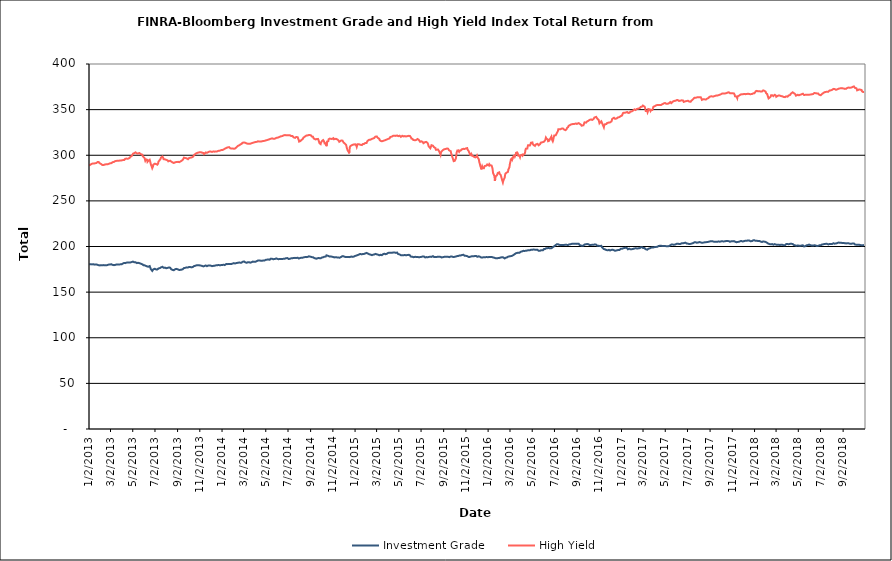
| Category | Investment Grade | High Yield |
|---|---|---|
| 1/2/13 | 180.418 | 288.714 |
| 1/3/13 | 180.314 | 289.229 |
| 1/4/13 | 180.218 | 289.691 |
| 1/7/13 | 180.416 | 290.115 |
| 1/8/13 | 180.534 | 290.229 |
| 1/9/13 | 180.497 | 290.492 |
| 1/10/13 | 180.403 | 290.811 |
| 1/11/13 | 180.366 | 291.068 |
| 1/14/13 | 180.474 | 290.972 |
| 1/15/13 | 180.457 | 290.556 |
| 1/16/13 | 180.451 | 290.825 |
| 1/17/13 | 180.126 | 291.101 |
| 1/18/13 | 180.262 | 291.424 |
| 1/22/13 | 180.359 | 291.542 |
| 1/23/13 | 180.414 | 291.942 |
| 1/24/13 | 180.258 | 292.239 |
| 1/25/13 | 179.88 | 292.639 |
| 1/28/13 | 179.528 | 292.699 |
| 1/29/13 | 179.475 | 291.968 |
| 1/30/13 | 179.216 | 291.435 |
| 1/31/13 | 179.282 | 290.547 |
| 2/1/13 | 179.319 | 290.795 |
| 2/4/13 | 179.396 | 290.328 |
| 2/5/13 | 179.186 | 289.927 |
| 2/6/13 | 179.33 | 289.626 |
| 2/7/13 | 179.53 | 289.348 |
| 2/8/13 | 179.424 | 289.123 |
| 2/11/13 | 179.601 | 289.312 |
| 2/12/13 | 179.432 | 289.517 |
| 2/13/13 | 179.276 | 289.685 |
| 2/14/13 | 179.47 | 289.903 |
| 2/15/13 | 179.428 | 289.938 |
| 2/19/13 | 179.436 | 290.138 |
| 2/20/13 | 179.393 | 290.311 |
| 2/21/13 | 179.67 | 289.894 |
| 2/22/13 | 179.791 | 290.126 |
| 2/25/13 | 180.195 | 290.674 |
| 2/26/13 | 180.36 | 290.49 |
| 2/27/13 | 180.275 | 290.647 |
| 2/28/13 | 180.295 | 291.129 |
| 3/1/13 | 180.498 | 291.056 |
| 3/4/13 | 180.547 | 291.371 |
| 3/5/13 | 180.405 | 292.183 |
| 3/6/13 | 180.162 | 292.263 |
| 3/7/13 | 179.864 | 292.342 |
| 3/8/13 | 179.491 | 292.364 |
| 3/11/13 | 179.561 | 292.71 |
| 3/12/13 | 179.833 | 292.986 |
| 3/13/13 | 179.763 | 292.997 |
| 3/14/13 | 179.781 | 293.521 |
| 3/15/13 | 180.017 | 293.66 |
| 3/18/13 | 180.309 | 293.843 |
| 3/19/13 | 180.56 | 293.925 |
| 3/20/13 | 180.234 | 294.009 |
| 3/21/13 | 180.19 | 293.882 |
| 3/22/13 | 180.169 | 293.97 |
| 3/25/13 | 180.202 | 294.027 |
| 3/26/13 | 180.105 | 293.998 |
| 3/27/13 | 180.419 | 294.128 |
| 3/28/13 | 180.443 | 294.272 |
| 4/1/13 | 180.531 | 294.371 |
| 4/2/13 | 180.461 | 294.579 |
| 4/3/13 | 180.789 | 294.607 |
| 4/4/13 | 181.285 | 294.648 |
| 4/5/13 | 181.945 | 294.632 |
| 4/8/13 | 182.004 | 294.735 |
| 4/9/13 | 182.049 | 295.329 |
| 4/10/13 | 181.764 | 295.607 |
| 4/11/13 | 181.777 | 296.149 |
| 4/12/13 | 182.134 | 296.506 |
| 4/15/13 | 182.382 | 296.343 |
| 4/16/13 | 182.309 | 296.556 |
| 4/17/13 | 182.364 | 296.241 |
| 4/18/13 | 182.416 | 296.14 |
| 4/19/13 | 182.332 | 296.394 |
| 4/22/13 | 182.498 | 296.78 |
| 4/23/13 | 182.612 | 297.392 |
| 4/24/13 | 182.699 | 297.751 |
| 4/25/13 | 182.517 | 298.19 |
| 4/26/13 | 182.907 | 298.71 |
| 4/29/13 | 183.005 | 299.268 |
| 4/30/13 | 183.021 | 300.067 |
| 5/1/13 | 183.331 | 300.856 |
| 5/2/13 | 183.461 | 301.386 |
| 5/3/13 | 182.88 | 301.968 |
| 5/6/13 | 182.703 | 302.267 |
| 5/7/13 | 182.682 | 302.749 |
| 5/8/13 | 182.755 | 303.216 |
| 5/9/13 | 182.747 | 303.174 |
| 5/10/13 | 182.048 | 302.716 |
| 5/13/13 | 181.775 | 302.027 |
| 5/14/13 | 181.74 | 301.767 |
| 5/15/13 | 181.725 | 301.705 |
| 5/16/13 | 182.182 | 302.013 |
| 5/17/13 | 181.879 | 302.136 |
| 5/20/13 | 181.74 | 302.424 |
| 5/21/13 | 181.831 | 302.406 |
| 5/22/13 | 181.51 | 302.291 |
| 5/23/13 | 181.254 | 301.321 |
| 5/24/13 | 181.269 | 300.988 |
| 5/28/13 | 180.478 | 300.573 |
| 5/29/13 | 179.983 | 298.941 |
| 5/30/13 | 179.917 | 298.874 |
| 5/31/13 | 179.394 | 298.159 |
| 6/3/13 | 179.454 | 296.868 |
| 6/4/13 | 179.162 | 296.146 |
| 6/5/13 | 178.829 | 293.959 |
| 6/6/13 | 178.861 | 293.342 |
| 6/7/13 | 178.695 | 295.478 |
| 6/10/13 | 178.13 | 295.107 |
| 6/11/13 | 177.577 | 292.825 |
| 6/12/13 | 177.663 | 293.39 |
| 6/13/13 | 177.842 | 292.841 |
| 6/14/13 | 178.613 | 294.18 |
| 6/17/13 | 178.554 | 295.091 |
| 6/18/13 | 178.04 | 294.81 |
| 6/19/13 | 177.631 | 294.581 |
| 6/20/13 | 175.366 | 290.384 |
| 6/21/13 | 174.752 | 289.646 |
| 6/24/13 | 173.249 | 285.828 |
| 6/25/13 | 173.543 | 286.221 |
| 6/26/13 | 174.232 | 287.65 |
| 6/27/13 | 174.959 | 289.73 |
| 6/28/13 | 175.137 | 290.228 |
| 7/1/13 | 175.576 | 290.788 |
| 7/2/13 | 175.941 | 291.105 |
| 7/3/13 | 175.988 | 290.585 |
| 7/5/13 | 174.738 | 290.273 |
| 7/8/13 | 174.822 | 289.667 |
| 7/9/13 | 175.184 | 290.346 |
| 7/10/13 | 175.151 | 290.844 |
| 7/11/13 | 175.898 | 292.926 |
| 7/12/13 | 176.14 | 293.609 |
| 7/15/13 | 176.351 | 294.919 |
| 7/16/13 | 176.666 | 295.47 |
| 7/17/13 | 177.121 | 296.161 |
| 7/18/13 | 177.12 | 297.519 |
| 7/19/13 | 177.42 | 297.862 |
| 7/22/13 | 177.769 | 298.556 |
| 7/23/13 | 177.698 | 298.585 |
| 7/24/13 | 176.991 | 297.183 |
| 7/25/13 | 176.669 | 295.729 |
| 7/26/13 | 177.005 | 295.673 |
| 7/29/13 | 176.886 | 295.5 |
| 7/30/13 | 176.857 | 295.631 |
| 7/31/13 | 176.508 | 295.054 |
| 8/1/13 | 176.191 | 295.026 |
| 8/2/13 | 176.666 | 294.693 |
| 8/5/13 | 176.529 | 294.436 |
| 8/6/13 | 176.451 | 293.84 |
| 8/7/13 | 176.654 | 293.33 |
| 8/8/13 | 176.91 | 293.6 |
| 8/9/13 | 176.889 | 293.805 |
| 8/12/13 | 176.834 | 294.05 |
| 8/13/13 | 176.01 | 293.634 |
| 8/14/13 | 175.868 | 293.796 |
| 8/15/13 | 175.063 | 293.112 |
| 8/16/13 | 174.752 | 292.875 |
| 8/19/13 | 174.276 | 292.095 |
| 8/20/13 | 174.561 | 291.862 |
| 8/21/13 | 174.282 | 291.78 |
| 8/22/13 | 173.987 | 291.473 |
| 8/23/13 | 174.557 | 291.996 |
| 8/26/13 | 175.088 | 292.307 |
| 8/27/13 | 175.55 | 292.162 |
| 8/28/13 | 175.33 | 292.241 |
| 8/29/13 | 175.469 | 292.563 |
| 8/30/13 | 175.752 | 293.08 |
| 9/3/13 | 174.857 | 292.778 |
| 9/4/13 | 174.803 | 292.764 |
| 9/5/13 | 173.839 | 292.314 |
| 9/6/13 | 174.212 | 292.438 |
| 9/9/13 | 174.432 | 293.107 |
| 9/10/13 | 174.027 | 293 |
| 9/11/13 | 174.23 | 293.246 |
| 9/12/13 | 174.624 | 293.821 |
| 9/13/13 | 174.528 | 294.088 |
| 9/16/13 | 175.136 | 295.082 |
| 9/17/13 | 175.056 | 295.217 |
| 9/18/13 | 175.426 | 295.876 |
| 9/19/13 | 176.394 | 297.362 |
| 9/20/13 | 176.442 | 297.438 |
| 9/23/13 | 176.64 | 296.94 |
| 9/24/13 | 177.073 | 297.042 |
| 9/25/13 | 177.29 | 296.788 |
| 9/26/13 | 177.116 | 296.649 |
| 9/27/13 | 177.17 | 296.298 |
| 9/30/13 | 177.029 | 295.684 |
| 10/1/13 | 177.035 | 296.078 |
| 10/2/13 | 177.315 | 296.334 |
| 10/3/13 | 177.535 | 296.928 |
| 10/4/13 | 177.247 | 297.16 |
| 10/7/13 | 177.419 | 297.396 |
| 10/8/13 | 177.369 | 297.091 |
| 10/9/13 | 177.218 | 296.983 |
| 10/10/13 | 177.152 | 297.583 |
| 10/11/13 | 177.569 | 298.016 |
| 10/14/13 | 177.705 | 298.362 |
| 10/15/13 | 177.422 | 298.46 |
| 10/16/13 | 177.683 | 299.078 |
| 10/17/13 | 178.623 | 300.339 |
| 10/18/13 | 179.055 | 301.275 |
| 10/21/13 | 178.946 | 301.75 |
| 10/22/13 | 179.5 | 302.295 |
| 10/23/13 | 179.642 | 302.152 |
| 10/24/13 | 179.451 | 302.314 |
| 10/25/13 | 179.509 | 302.45 |
| 10/28/13 | 179.497 | 302.947 |
| 10/29/13 | 179.506 | 303.014 |
| 10/30/13 | 179.7 | 303.179 |
| 10/31/13 | 179.418 | 303.199 |
| 11/1/13 | 179.055 | 302.946 |
| 11/4/13 | 179.086 | 303.346 |
| 11/5/13 | 178.619 | 302.838 |
| 11/6/13 | 178.743 | 302.912 |
| 11/7/13 | 178.912 | 302.935 |
| 11/8/13 | 178.027 | 302.168 |
| 11/11/13 | 178.148 | 302.481 |
| 11/12/13 | 177.732 | 301.574 |
| 11/13/13 | 178.044 | 301.25 |
| 11/14/13 | 178.581 | 301.928 |
| 11/15/13 | 178.699 | 302.34 |
| 11/18/13 | 179.216 | 303.154 |
| 11/19/13 | 179.056 | 303.064 |
| 11/20/13 | 178.763 | 302.951 |
| 11/21/13 | 178.483 | 302.637 |
| 11/22/13 | 178.866 | 303.162 |
| 11/25/13 | 179.18 | 303.49 |
| 11/26/13 | 179.447 | 303.451 |
| 11/27/13 | 179.295 | 303.964 |
| 11/29/13 | 179.243 | 304.187 |
| 12/2/13 | 178.936 | 303.959 |
| 12/3/13 | 179.077 | 304.022 |
| 12/4/13 | 178.638 | 303.759 |
| 12/5/13 | 178.482 | 303.661 |
| 12/6/13 | 178.524 | 303.958 |
| 12/9/13 | 178.794 | 304.229 |
| 12/10/13 | 179.26 | 304.454 |
| 12/11/13 | 179.244 | 304.384 |
| 12/12/13 | 178.971 | 303.923 |
| 12/13/13 | 179.064 | 304.033 |
| 12/16/13 | 179.328 | 304.232 |
| 12/17/13 | 179.548 | 304.208 |
| 12/18/13 | 179.531 | 304.127 |
| 12/19/13 | 179.415 | 304.237 |
| 12/20/13 | 179.659 | 304.524 |
| 12/23/13 | 179.774 | 304.868 |
| 12/24/13 | 179.596 | 304.866 |
| 12/26/13 | 179.421 | 304.99 |
| 12/27/13 | 179.346 | 305.23 |
| 12/30/13 | 179.619 | 305.626 |
| 12/31/13 | 179.735 | 305.727 |
| 1/2/14 | 179.728 | 305.662 |
| 1/3/14 | 179.753 | 305.864 |
| 1/6/14 | 180.039 | 306.408 |
| 1/7/14 | 180.116 | 306.94 |
| 1/8/14 | 179.579 | 306.969 |
| 1/9/14 | 179.671 | 307.098 |
| 1/10/14 | 180.4 | 307.505 |
| 1/13/14 | 180.811 | 307.909 |
| 1/14/14 | 180.596 | 307.963 |
| 1/15/14 | 180.41 | 308.397 |
| 1/16/14 | 180.672 | 308.499 |
| 1/17/14 | 180.742 | 308.963 |
| 1/21/14 | 180.804 | 308.937 |
| 1/22/14 | 180.542 | 309.084 |
| 1/23/14 | 180.718 | 308.76 |
| 1/24/14 | 180.846 | 307.697 |
| 1/27/14 | 180.803 | 307.291 |
| 1/28/14 | 180.86 | 307.421 |
| 1/29/14 | 181.147 | 307.34 |
| 1/30/14 | 181.221 | 307.5 |
| 1/31/14 | 181.355 | 307.291 |
| 2/3/14 | 181.763 | 307.131 |
| 2/4/14 | 181.689 | 307.001 |
| 2/5/14 | 181.423 | 306.844 |
| 2/6/14 | 181.395 | 307.294 |
| 2/7/14 | 181.768 | 308.141 |
| 2/10/14 | 181.871 | 308.736 |
| 2/11/14 | 181.686 | 309.108 |
| 2/12/14 | 181.564 | 309.671 |
| 2/13/14 | 182.068 | 309.957 |
| 2/14/14 | 182.2 | 310.47 |
| 2/18/14 | 182.466 | 310.993 |
| 2/19/14 | 182.465 | 311.258 |
| 2/20/14 | 182.013 | 311.434 |
| 2/21/14 | 182.187 | 311.855 |
| 2/24/14 | 182.309 | 312.532 |
| 2/25/14 | 182.786 | 313.061 |
| 2/26/14 | 182.966 | 313.386 |
| 2/27/14 | 183.242 | 313.688 |
| 2/28/14 | 183.242 | 313.95 |
| 3/3/14 | 183.617 | 313.958 |
| 3/4/14 | 183.201 | 314.086 |
| 3/5/14 | 183.098 | 314.146 |
| 3/6/14 | 182.707 | 313.68 |
| 3/7/14 | 182.162 | 313.23 |
| 3/10/14 | 182.161 | 312.94 |
| 3/11/14 | 182.18 | 312.996 |
| 3/12/14 | 182.373 | 312.805 |
| 3/13/14 | 182.68 | 312.601 |
| 3/14/14 | 182.791 | 312.17 |
| 3/17/14 | 182.764 | 312.694 |
| 3/18/14 | 182.841 | 312.994 |
| 3/19/14 | 182.684 | 313.321 |
| 3/20/14 | 182.283 | 312.665 |
| 3/21/14 | 182.579 | 313.2 |
| 3/24/14 | 182.821 | 313.213 |
| 3/25/14 | 182.966 | 313.327 |
| 3/26/14 | 183.239 | 313.866 |
| 3/27/14 | 183.453 | 313.624 |
| 3/28/14 | 183.28 | 313.939 |
| 3/31/14 | 183.295 | 314.186 |
| 4/1/14 | 183.326 | 314.175 |
| 4/2/14 | 182.944 | 314.368 |
| 4/3/14 | 183.181 | 314.462 |
| 4/4/14 | 183.667 | 314.772 |
| 4/7/14 | 184.06 | 314.72 |
| 4/8/14 | 184.138 | 314.878 |
| 4/9/14 | 184.201 | 315.146 |
| 4/10/14 | 184.696 | 315.282 |
| 4/11/14 | 184.791 | 314.863 |
| 4/14/14 | 184.777 | 315.029 |
| 4/15/14 | 184.821 | 314.902 |
| 4/16/14 | 184.74 | 315.02 |
| 4/17/14 | 184.509 | 315.085 |
| 4/21/14 | 184.449 | 315.235 |
| 4/22/14 | 184.345 | 315.366 |
| 4/23/14 | 184.609 | 315.544 |
| 4/24/14 | 184.557 | 315.604 |
| 4/25/14 | 184.79 | 315.711 |
| 4/28/14 | 184.686 | 315.777 |
| 4/29/14 | 184.555 | 315.908 |
| 4/30/14 | 184.879 | 316.245 |
| 5/1/14 | 185.332 | 316.202 |
| 5/2/14 | 185.496 | 316.636 |
| 5/5/14 | 185.588 | 316.655 |
| 5/6/14 | 185.606 | 316.793 |
| 5/7/14 | 185.64 | 316.933 |
| 5/8/14 | 185.782 | 317.079 |
| 5/9/14 | 185.695 | 317.384 |
| 5/12/14 | 185.477 | 317.601 |
| 5/13/14 | 185.77 | 317.893 |
| 5/14/14 | 186.391 | 318.157 |
| 5/15/14 | 186.658 | 318.079 |
| 5/16/14 | 186.536 | 318.037 |
| 5/19/14 | 186.535 | 318.482 |
| 5/20/14 | 186.465 | 318.324 |
| 5/21/14 | 186.201 | 318.324 |
| 5/22/14 | 186.056 | 318.13 |
| 5/23/14 | 186.327 | 318.26 |
| 5/27/14 | 186.419 | 318.216 |
| 5/28/14 | 187.106 | 318.396 |
| 5/29/14 | 187.185 | 318.6 |
| 5/30/14 | 186.936 | 318.99 |
| 6/2/14 | 186.525 | 319.196 |
| 6/3/14 | 186.096 | 318.824 |
| 6/4/14 | 185.923 | 318.923 |
| 6/5/14 | 186.096 | 319.519 |
| 6/6/14 | 186.357 | 319.906 |
| 6/9/14 | 186.269 | 320.267 |
| 6/10/14 | 186.071 | 320.527 |
| 6/11/14 | 186.117 | 320.701 |
| 6/12/14 | 186.209 | 320.732 |
| 6/13/14 | 186.298 | 320.741 |
| 6/16/14 | 186.394 | 321.02 |
| 6/17/14 | 186.061 | 320.916 |
| 6/18/14 | 186.227 | 321.023 |
| 6/19/14 | 186.477 | 321.712 |
| 6/20/14 | 186.358 | 321.828 |
| 6/23/14 | 186.687 | 322.129 |
| 6/24/14 | 186.768 | 322.229 |
| 6/25/14 | 187.112 | 322.061 |
| 6/26/14 | 187.237 | 321.92 |
| 6/27/14 | 187.246 | 321.907 |
| 6/30/14 | 187.28 | 321.988 |
| 7/1/14 | 186.985 | 321.994 |
| 7/2/14 | 186.597 | 321.974 |
| 7/3/14 | 186.327 | 321.934 |
| 7/7/14 | 186.526 | 321.932 |
| 7/8/14 | 186.93 | 321.735 |
| 7/9/14 | 186.875 | 321.432 |
| 7/10/14 | 187.101 | 320.961 |
| 7/11/14 | 187.261 | 320.984 |
| 7/14/14 | 187.168 | 320.983 |
| 7/15/14 | 187.05 | 320.744 |
| 7/16/14 | 187.124 | 320.402 |
| 7/17/14 | 187.478 | 319.546 |
| 7/18/14 | 187.415 | 319.119 |
| 7/21/14 | 187.552 | 319.067 |
| 7/22/14 | 187.59 | 319.413 |
| 7/23/14 | 187.802 | 320.013 |
| 7/24/14 | 187.45 | 320.044 |
| 7/25/14 | 187.698 | 320.029 |
| 7/28/14 | 187.674 | 319.769 |
| 7/29/14 | 187.837 | 319.656 |
| 7/30/14 | 187.301 | 319.047 |
| 7/31/14 | 186.886 | 316.528 |
| 8/1/14 | 187.092 | 314.942 |
| 8/4/14 | 187.413 | 315.476 |
| 8/5/14 | 187.252 | 316.358 |
| 8/6/14 | 187.363 | 316.277 |
| 8/7/14 | 187.673 | 316.579 |
| 8/8/14 | 187.896 | 316.826 |
| 8/11/14 | 187.77 | 317.856 |
| 8/12/14 | 187.676 | 318.383 |
| 8/13/14 | 187.876 | 319.344 |
| 8/14/14 | 188.161 | 319.663 |
| 8/15/14 | 188.62 | 319.986 |
| 8/18/14 | 188.479 | 320.831 |
| 8/19/14 | 188.396 | 321.336 |
| 8/20/14 | 188.206 | 321.492 |
| 8/21/14 | 188.347 | 321.61 |
| 8/22/14 | 188.447 | 321.622 |
| 8/25/14 | 188.701 | 321.818 |
| 8/26/14 | 188.792 | 322.093 |
| 8/27/14 | 188.959 | 322.039 |
| 8/28/14 | 189.247 | 322.212 |
| 8/29/14 | 189.332 | 322.307 |
| 9/2/14 | 188.727 | 321.963 |
| 9/3/14 | 188.618 | 321.632 |
| 9/4/14 | 188.349 | 321.109 |
| 9/5/14 | 188.346 | 320.463 |
| 9/8/14 | 188.284 | 320.285 |
| 9/9/14 | 187.806 | 319.5 |
| 9/10/14 | 187.427 | 318.374 |
| 9/11/14 | 187.429 | 317.872 |
| 9/12/14 | 186.837 | 317.625 |
| 9/15/14 | 186.884 | 317.32 |
| 9/16/14 | 186.942 | 316.989 |
| 9/17/14 | 186.928 | 317.395 |
| 9/18/14 | 186.65 | 317.716 |
| 9/19/14 | 186.954 | 318.104 |
| 9/22/14 | 187.276 | 317.886 |
| 9/23/14 | 187.426 | 316.785 |
| 9/24/14 | 187.209 | 316.242 |
| 9/25/14 | 187.279 | 314.369 |
| 9/26/14 | 186.843 | 313.067 |
| 9/29/14 | 187.044 | 312.227 |
| 9/30/14 | 187.078 | 313.839 |
| 10/1/14 | 187.741 | 314.5 |
| 10/2/14 | 187.805 | 314.68 |
| 10/3/14 | 187.775 | 315.764 |
| 10/6/14 | 188.229 | 316.652 |
| 10/7/14 | 188.613 | 315.906 |
| 10/8/14 | 188.736 | 315.449 |
| 10/9/14 | 188.86 | 314.322 |
| 10/10/14 | 188.827 | 312.945 |
| 10/13/14 | 188.921 | 313.229 |
| 10/14/14 | 189.474 | 311.473 |
| 10/15/14 | 190.361 | 309.937 |
| 10/16/14 | 189.617 | 311.032 |
| 10/17/14 | 189.527 | 315.087 |
| 10/20/14 | 189.692 | 315.391 |
| 10/21/14 | 189.622 | 317.481 |
| 10/22/14 | 189.473 | 317.828 |
| 10/23/14 | 189.056 | 318.169 |
| 10/24/14 | 189.113 | 318.268 |
| 10/27/14 | 189.192 | 317.999 |
| 10/28/14 | 189.053 | 318.308 |
| 10/29/14 | 188.673 | 318.003 |
| 10/30/14 | 188.788 | 317.85 |
| 10/31/14 | 188.531 | 318.489 |
| 11/3/14 | 188.389 | 318.666 |
| 11/4/14 | 188.42 | 317.568 |
| 11/5/14 | 188.206 | 317.764 |
| 11/6/14 | 188.056 | 317.831 |
| 11/7/14 | 188.309 | 317.73 |
| 11/10/14 | 188.303 | 318.028 |
| 11/11/14 | 188.337 | 318.366 |
| 11/12/14 | 188.151 | 317.973 |
| 11/13/14 | 188.062 | 317.544 |
| 11/14/14 | 188.002 | 316.97 |
| 11/17/14 | 187.855 | 316.264 |
| 11/18/14 | 187.783 | 315.504 |
| 11/19/14 | 187.533 | 314.749 |
| 11/20/14 | 187.762 | 314.823 |
| 11/21/14 | 188.187 | 315.646 |
| 11/24/14 | 188.506 | 316.096 |
| 11/25/14 | 188.832 | 316.289 |
| 11/26/14 | 189.221 | 316.481 |
| 11/28/14 | 189.453 | 316.019 |
| 12/1/14 | 189.339 | 313.923 |
| 12/2/14 | 188.594 | 312.837 |
| 12/3/14 | 188.505 | 313.025 |
| 12/4/14 | 188.701 | 312.974 |
| 12/5/14 | 188.301 | 312.533 |
| 12/8/14 | 188.448 | 311.404 |
| 12/9/14 | 188.664 | 309.375 |
| 12/10/14 | 188.681 | 307.796 |
| 12/11/14 | 188.559 | 307.125 |
| 12/12/14 | 188.929 | 305.319 |
| 12/15/14 | 188.561 | 303.76 |
| 12/16/14 | 188.411 | 302.104 |
| 12/17/14 | 188.632 | 304.814 |
| 12/18/14 | 188.376 | 308.594 |
| 12/19/14 | 188.733 | 309.774 |
| 12/22/14 | 188.996 | 310.688 |
| 12/23/14 | 188.785 | 311.246 |
| 12/24/14 | 188.507 | 311.397 |
| 12/26/14 | 188.632 | 311.433 |
| 12/29/14 | 188.966 | 311.834 |
| 12/30/14 | 189.326 | 311.52 |
| 12/31/14 | 189.333 | 311.585 |
| 1/2/15 | 189.707 | 311.981 |
| 1/5/15 | 190.061 | 310.514 |
| 1/6/15 | 190.617 | 309.236 |
| 1/7/15 | 190.665 | 310.323 |
| 1/8/15 | 190.51 | 312.032 |
| 1/9/15 | 190.821 | 312.279 |
| 1/12/15 | 191.135 | 312.116 |
| 1/13/15 | 191.197 | 311.828 |
| 1/14/15 | 191.521 | 311.162 |
| 1/15/15 | 191.841 | 311.605 |
| 1/16/15 | 191.445 | 311.391 |
| 1/20/15 | 191.389 | 311.144 |
| 1/21/15 | 191.221 | 311.199 |
| 1/22/15 | 191.103 | 311.857 |
| 1/23/15 | 191.851 | 312.326 |
| 1/26/15 | 191.9 | 312.417 |
| 1/27/15 | 192.1 | 312.884 |
| 1/28/15 | 192.361 | 313.314 |
| 1/29/15 | 192.305 | 313.305 |
| 1/30/15 | 192.95 | 313.334 |
| 2/2/15 | 192.968 | 313.318 |
| 2/3/15 | 192.453 | 314.525 |
| 2/4/15 | 192.202 | 315.219 |
| 2/5/15 | 192.42 | 315.883 |
| 2/6/15 | 191.635 | 316.843 |
| 2/9/15 | 191.513 | 316.93 |
| 2/10/15 | 191.119 | 317.059 |
| 2/11/15 | 191.011 | 316.766 |
| 2/12/15 | 191.228 | 316.948 |
| 2/13/15 | 191.17 | 317.553 |
| 2/17/15 | 190.516 | 317.925 |
| 2/18/15 | 190.732 | 318.48 |
| 2/19/15 | 190.899 | 318.317 |
| 2/20/15 | 191.064 | 318.426 |
| 2/23/15 | 191.233 | 318.871 |
| 2/24/15 | 191.796 | 319.378 |
| 2/25/15 | 192.095 | 319.888 |
| 2/26/15 | 191.89 | 320.343 |
| 2/27/15 | 191.784 | 320.609 |
| 3/2/15 | 191.428 | 320.621 |
| 3/3/15 | 191.217 | 320.166 |
| 3/4/15 | 191.071 | 319.366 |
| 3/5/15 | 191.13 | 319.372 |
| 3/6/15 | 190.188 | 318.446 |
| 3/9/15 | 190.354 | 317.968 |
| 3/10/15 | 190.614 | 316.558 |
| 3/11/15 | 190.601 | 316.519 |
| 3/12/15 | 190.908 | 316.885 |
| 3/13/15 | 190.461 | 315.689 |
| 3/16/15 | 190.47 | 315.333 |
| 3/17/15 | 190.485 | 314.448 |
| 3/18/15 | 191.067 | 314.742 |
| 3/19/15 | 191.54 | 315.682 |
| 3/20/15 | 191.822 | 315.866 |
| 3/23/15 | 192.11 | 316.214 |
| 3/24/15 | 192.44 | 316.861 |
| 3/25/15 | 192.239 | 316.964 |
| 3/26/15 | 191.565 | 316.677 |
| 3/27/15 | 191.862 | 317.03 |
| 3/30/15 | 192.098 | 317.31 |
| 3/31/15 | 192.401 | 317.42 |
| 4/1/15 | 193.098 | 317.516 |
| 4/2/15 | 193.003 | 317.916 |
| 4/6/15 | 193.061 | 318.403 |
| 4/7/15 | 193.189 | 319.183 |
| 4/8/15 | 193.294 | 319.982 |
| 4/9/15 | 193.065 | 319.944 |
| 4/10/15 | 193.121 | 320.249 |
| 4/13/15 | 193.1 | 320.514 |
| 4/14/15 | 193.634 | 320.559 |
| 4/15/15 | 193.607 | 321.112 |
| 4/16/15 | 193.507 | 321.387 |
| 4/17/15 | 193.596 | 321.137 |
| 4/20/15 | 193.52 | 321.448 |
| 4/21/15 | 193.485 | 321.42 |
| 4/22/15 | 193.004 | 321.095 |
| 4/23/15 | 193.028 | 321.187 |
| 4/24/15 | 193.376 | 321.481 |
| 4/27/15 | 193.341 | 321.656 |
| 4/28/15 | 192.898 | 321.552 |
| 4/29/15 | 191.919 | 321.035 |
| 4/30/15 | 191.641 | 320.923 |
| 5/1/15 | 191.347 | 320.985 |
| 5/4/15 | 191.24 | 321.415 |
| 5/5/15 | 190.804 | 321.24 |
| 5/6/15 | 190.311 | 320.599 |
| 5/7/15 | 190.486 | 320.138 |
| 5/8/15 | 191.114 | 321.066 |
| 5/11/15 | 190.518 | 321.303 |
| 5/12/15 | 190.062 | 320.241 |
| 5/13/15 | 190.17 | 320.532 |
| 5/14/15 | 190.341 | 320.675 |
| 5/15/15 | 191.128 | 321.09 |
| 5/18/15 | 190.766 | 321.013 |
| 5/19/15 | 190.19 | 320.685 |
| 5/20/15 | 190.072 | 320.346 |
| 5/21/15 | 190.363 | 320.591 |
| 5/22/15 | 190.34 | 320.969 |
| 5/26/15 | 190.75 | 321.078 |
| 5/27/15 | 190.746 | 321.085 |
| 5/28/15 | 190.768 | 320.932 |
| 5/29/15 | 190.858 | 321.287 |
| 6/1/15 | 190.299 | 321.112 |
| 6/2/15 | 189.535 | 320.755 |
| 6/3/15 | 188.981 | 320.082 |
| 6/4/15 | 189.213 | 319.441 |
| 6/5/15 | 188.734 | 318.312 |
| 6/8/15 | 188.775 | 317.984 |
| 6/9/15 | 188.302 | 317.115 |
| 6/10/15 | 187.769 | 316.776 |
| 6/11/15 | 188.261 | 317.519 |
| 6/12/15 | 188.635 | 317.054 |
| 6/15/15 | 188.648 | 316.418 |
| 6/16/15 | 188.708 | 316.12 |
| 6/17/15 | 188.537 | 316.3 |
| 6/18/15 | 188.609 | 316.722 |
| 6/19/15 | 189.116 | 317.238 |
| 6/22/15 | 188.628 | 317.811 |
| 6/23/15 | 188.3 | 317.684 |
| 6/24/15 | 188.338 | 317.368 |
| 6/25/15 | 188.237 | 317.021 |
| 6/26/15 | 187.822 | 316.337 |
| 6/29/15 | 188.375 | 314.703 |
| 6/30/15 | 188.681 | 314.864 |
| 7/1/15 | 188.274 | 315.1 |
| 7/2/15 | 188.576 | 315.355 |
| 7/6/15 | 189.147 | 314.576 |
| 7/7/15 | 189.675 | 313.726 |
| 7/8/15 | 189.613 | 313.221 |
| 7/9/15 | 189.158 | 313.623 |
| 7/10/15 | 188.346 | 313.933 |
| 7/13/15 | 188.004 | 314.451 |
| 7/14/15 | 188.086 | 314.425 |
| 7/15/15 | 188.263 | 314.773 |
| 7/16/15 | 188.395 | 314.607 |
| 7/17/15 | 188.539 | 313.541 |
| 7/20/15 | 188.252 | 313.008 |
| 7/21/15 | 188.364 | 311.89 |
| 7/22/15 | 188.518 | 310.158 |
| 7/23/15 | 188.582 | 309.546 |
| 7/24/15 | 188.713 | 309.053 |
| 7/27/15 | 188.742 | 307.675 |
| 7/28/15 | 188.674 | 307.681 |
| 7/29/15 | 188.468 | 309.739 |
| 7/30/15 | 188.615 | 311.038 |
| 7/31/15 | 189.136 | 310.99 |
| 8/3/15 | 189.44 | 310.44 |
| 8/4/15 | 189.213 | 310.662 |
| 8/5/15 | 188.525 | 310.156 |
| 8/6/15 | 188.549 | 308.888 |
| 8/7/15 | 188.722 | 307.831 |
| 8/10/15 | 188.414 | 307.899 |
| 8/11/15 | 188.993 | 306.132 |
| 8/12/15 | 188.87 | 305.253 |
| 8/13/15 | 188.469 | 306.097 |
| 8/14/15 | 188.452 | 306.11 |
| 8/17/15 | 188.806 | 306.314 |
| 8/18/15 | 188.592 | 306.318 |
| 8/19/15 | 188.512 | 305.434 |
| 8/20/15 | 188.837 | 304.431 |
| 8/21/15 | 188.933 | 303.589 |
| 8/24/15 | 188.595 | 300.424 |
| 8/25/15 | 188.204 | 302.606 |
| 8/26/15 | 187.67 | 302.604 |
| 8/27/15 | 188.019 | 304.35 |
| 8/28/15 | 188.358 | 305.18 |
| 8/31/15 | 188.367 | 305.826 |
| 9/1/15 | 188.247 | 304.962 |
| 9/2/15 | 188.362 | 305.418 |
| 9/3/15 | 188.653 | 306.544 |
| 9/4/15 | 189.01 | 306.28 |
| 9/8/15 | 188.718 | 307.036 |
| 9/9/15 | 188.655 | 307.608 |
| 9/10/15 | 188.494 | 307.246 |
| 9/11/15 | 188.665 | 307.363 |
| 9/14/15 | 188.69 | 307.074 |
| 9/15/15 | 188.159 | 306.609 |
| 9/16/15 | 187.944 | 305.521 |
| 9/17/15 | 188.34 | 305.22 |
| 9/18/15 | 189.306 | 304.649 |
| 9/21/15 | 189.059 | 304.37 |
| 9/22/15 | 189.258 | 302.461 |
| 9/23/15 | 189.047 | 301.926 |
| 9/24/15 | 189.028 | 299.581 |
| 9/25/15 | 188.577 | 299.012 |
| 9/28/15 | 188.471 | 295.006 |
| 9/29/15 | 188.44 | 293.54 |
| 9/30/15 | 188.623 | 294.564 |
| 10/1/15 | 188.623 | 294.486 |
| 10/2/15 | 189.14 | 293.886 |
| 10/5/15 | 189.025 | 296.403 |
| 10/6/15 | 189.276 | 299.244 |
| 10/7/15 | 189.595 | 302.748 |
| 10/8/15 | 189.43 | 302.803 |
| 10/9/15 | 189.435 | 305.191 |
| 10/12/15 | 189.631 | 305.396 |
| 10/13/15 | 189.828 | 304.61 |
| 10/14/15 | 190.284 | 303.801 |
| 10/15/15 | 190.206 | 303.775 |
| 10/16/15 | 190.278 | 305.084 |
| 10/19/15 | 190.23 | 305.351 |
| 10/20/15 | 190.028 | 305.83 |
| 10/21/15 | 190.51 | 306.449 |
| 10/22/15 | 190.755 | 305.933 |
| 10/23/15 | 190.542 | 306.998 |
| 10/26/15 | 190.885 | 307.039 |
| 10/27/15 | 190.974 | 306.329 |
| 10/28/15 | 190.541 | 306.511 |
| 10/29/15 | 189.77 | 306.829 |
| 10/30/15 | 189.791 | 306.783 |
| 11/2/15 | 189.726 | 307.628 |
| 11/3/15 | 189.6 | 308.064 |
| 11/4/15 | 189.523 | 308.412 |
| 11/5/15 | 189.453 | 307.838 |
| 11/6/15 | 188.847 | 306.34 |
| 11/9/15 | 188.6 | 304.619 |
| 11/10/15 | 188.716 | 303.578 |
| 11/11/15 | 188.833 | 303.745 |
| 11/12/15 | 188.608 | 301.988 |
| 11/13/15 | 188.887 | 300.485 |
| 11/16/15 | 189.089 | 299.857 |
| 11/17/15 | 189.003 | 301.109 |
| 11/18/15 | 189.028 | 300.852 |
| 11/19/15 | 189.435 | 299.564 |
| 11/20/15 | 189.385 | 299.468 |
| 11/23/15 | 189.322 | 298.54 |
| 11/24/15 | 189.411 | 297.716 |
| 11/25/15 | 189.478 | 297.794 |
| 11/27/15 | 189.585 | 297.664 |
| 11/30/15 | 189.558 | 298.227 |
| 12/1/15 | 190.086 | 299.118 |
| 12/2/15 | 189.953 | 299.72 |
| 12/3/15 | 188.758 | 298.59 |
| 12/4/15 | 188.919 | 297.419 |
| 12/7/15 | 189.292 | 295.635 |
| 12/8/15 | 188.972 | 293.107 |
| 12/9/15 | 188.913 | 293.184 |
| 12/10/15 | 188.785 | 292.429 |
| 12/11/15 | 188.792 | 288.532 |
| 12/14/15 | 187.841 | 284.516 |
| 12/15/15 | 187.577 | 286.934 |
| 12/16/15 | 187.538 | 288.067 |
| 12/17/15 | 187.998 | 288.032 |
| 12/18/15 | 188.195 | 285.949 |
| 12/21/15 | 188.295 | 285.827 |
| 12/22/15 | 188.067 | 286.645 |
| 12/23/15 | 188.046 | 288.156 |
| 12/24/15 | 188.194 | 288.68 |
| 12/28/15 | 188.439 | 288.682 |
| 12/29/15 | 188.099 | 289.708 |
| 12/30/15 | 188.072 | 289.923 |
| 12/31/15 | 188.32 | 289.896 |
| 1/4/16 | 188.381 | 288.66 |
| 1/5/16 | 188.267 | 290.104 |
| 1/6/16 | 188.652 | 290.134 |
| 1/7/16 | 188.566 | 288.992 |
| 1/8/16 | 188.818 | 289.452 |
| 1/11/16 | 188.546 | 288.696 |
| 1/12/16 | 188.571 | 287.678 |
| 1/13/16 | 188.602 | 286.344 |
| 1/14/16 | 188.152 | 284.133 |
| 1/15/16 | 188.039 | 280.669 |
| 1/19/16 | 187.614 | 276.856 |
| 1/20/16 | 187.117 | 271.948 |
| 1/21/16 | 187.26 | 273.375 |
| 1/22/16 | 187.182 | 276.914 |
| 1/25/16 | 187.235 | 277.728 |
| 1/26/16 | 187.33 | 278.532 |
| 1/27/16 | 187.065 | 279.194 |
| 1/28/16 | 187.241 | 280.568 |
| 1/29/16 | 187.696 | 281.653 |
| 2/1/16 | 187.417 | 281.298 |
| 2/2/16 | 187.72 | 279.608 |
| 2/3/16 | 187.721 | 279.031 |
| 2/4/16 | 187.855 | 279.454 |
| 2/5/16 | 187.886 | 278.382 |
| 2/8/16 | 188.148 | 274.268 |
| 2/9/16 | 187.944 | 272.672 |
| 2/10/16 | 188.182 | 273.675 |
| 2/11/16 | 188.283 | 270.177 |
| 2/12/16 | 187.702 | 271.91 |
| 2/16/16 | 186.961 | 275.607 |
| 2/17/16 | 186.847 | 278.251 |
| 2/18/16 | 187.58 | 279.907 |
| 2/19/16 | 187.713 | 279.41 |
| 2/22/16 | 187.953 | 281.109 |
| 2/23/16 | 188.213 | 280.94 |
| 2/24/16 | 188.406 | 280.202 |
| 2/25/16 | 188.768 | 281.875 |
| 2/26/16 | 188.719 | 284.35 |
| 2/29/16 | 189.189 | 286.89 |
| 3/1/16 | 188.954 | 289.916 |
| 3/2/16 | 188.963 | 291.934 |
| 3/3/16 | 189.401 | 293.172 |
| 3/4/16 | 189.416 | 295.577 |
| 3/7/16 | 189.744 | 296.71 |
| 3/8/16 | 190.57 | 295.553 |
| 3/9/16 | 190.293 | 295.25 |
| 3/10/16 | 190.409 | 296.174 |
| 3/11/16 | 190.761 | 298.865 |
| 3/14/16 | 191.479 | 299.801 |
| 3/15/16 | 191.537 | 298.659 |
| 3/16/16 | 191.56 | 298.253 |
| 3/17/16 | 192.446 | 300.505 |
| 3/18/16 | 192.907 | 302.641 |
| 3/21/16 | 192.959 | 303.17 |
| 3/22/16 | 192.997 | 302.638 |
| 3/23/16 | 193.28 | 301.871 |
| 3/24/16 | 193.171 | 299.546 |
| 3/28/16 | 193.245 | 299.154 |
| 3/29/16 | 193.563 | 298.043 |
| 3/30/16 | 193.762 | 299.745 |
| 3/31/16 | 194.254 | 300.469 |
| 4/1/16 | 194.406 | 300.46 |
| 4/4/16 | 194.67 | 300.708 |
| 4/5/16 | 195.008 | 299.556 |
| 4/6/16 | 194.822 | 300.513 |
| 4/7/16 | 195.213 | 300.205 |
| 4/8/16 | 195.153 | 300.789 |
| 4/11/16 | 195.181 | 301.833 |
| 4/12/16 | 194.982 | 303.31 |
| 4/13/16 | 195.197 | 306.047 |
| 4/14/16 | 195.274 | 307.187 |
| 4/15/16 | 195.76 | 307.333 |
| 4/18/16 | 195.669 | 307.314 |
| 4/19/16 | 196.069 | 309.527 |
| 4/20/16 | 196.195 | 310.94 |
| 4/21/16 | 195.95 | 311.395 |
| 4/22/16 | 195.948 | 311.313 |
| 4/25/16 | 195.881 | 310.737 |
| 4/26/16 | 195.632 | 311.167 |
| 4/27/16 | 195.917 | 312.26 |
| 4/28/16 | 196.362 | 313.686 |
| 4/29/16 | 196.549 | 313.857 |
| 5/2/16 | 196.446 | 314.055 |
| 5/3/16 | 196.722 | 312.471 |
| 5/4/16 | 196.517 | 311.595 |
| 5/5/16 | 196.718 | 311.311 |
| 5/6/16 | 196.537 | 310.262 |
| 5/9/16 | 196.503 | 310.255 |
| 5/10/16 | 196.613 | 310.626 |
| 5/11/16 | 196.745 | 311.706 |
| 5/12/16 | 196.466 | 312.093 |
| 5/13/16 | 196.627 | 311.779 |
| 5/16/16 | 196.451 | 312.491 |
| 5/17/16 | 196.435 | 312.857 |
| 5/18/16 | 195.613 | 312.462 |
| 5/19/16 | 195.235 | 310.91 |
| 5/20/16 | 195.273 | 311.95 |
| 5/23/16 | 195.358 | 312.157 |
| 5/24/16 | 195.211 | 312.655 |
| 5/25/16 | 195.406 | 313.839 |
| 5/26/16 | 195.925 | 314.239 |
| 5/27/16 | 196.054 | 314.412 |
| 5/31/16 | 196.003 | 314.392 |
| 6/1/16 | 196.05 | 313.86 |
| 6/2/16 | 196.396 | 314.467 |
| 6/3/16 | 197.238 | 314.891 |
| 6/6/16 | 197.301 | 316.41 |
| 6/7/16 | 197.59 | 317.7 |
| 6/8/16 | 197.878 | 319.363 |
| 6/9/16 | 198.134 | 319.164 |
| 6/10/16 | 198.171 | 318.061 |
| 6/13/16 | 198.215 | 317.394 |
| 6/14/16 | 197.929 | 315.404 |
| 6/15/16 | 198.124 | 315.892 |
| 6/16/16 | 198.28 | 314.379 |
| 6/17/16 | 198.13 | 315.848 |
| 6/20/16 | 198.048 | 318.301 |
| 6/21/16 | 197.996 | 318.18 |
| 6/22/16 | 198.15 | 319.311 |
| 6/23/16 | 198.125 | 320.382 |
| 6/24/16 | 198.506 | 317.802 |
| 6/27/16 | 199.206 | 315.236 |
| 6/28/16 | 199.586 | 316.453 |
| 6/29/16 | 200.002 | 318.908 |
| 6/30/16 | 200.063 | 319.994 |
| 7/1/16 | 200.739 | 321.77 |
| 7/5/16 | 201.589 | 321.792 |
| 7/6/16 | 201.737 | 321.541 |
| 7/7/16 | 201.963 | 322.797 |
| 7/8/16 | 202.451 | 324.195 |
| 7/11/16 | 202.567 | 326.491 |
| 7/12/16 | 202.068 | 328.452 |
| 7/13/16 | 202.405 | 327.718 |
| 7/14/16 | 201.959 | 328.632 |
| 7/15/16 | 201.512 | 328.373 |
| 7/18/16 | 201.486 | 328.459 |
| 7/19/16 | 201.691 | 328.488 |
| 7/20/16 | 201.545 | 328.895 |
| 7/21/16 | 201.662 | 329.173 |
| 7/22/16 | 201.804 | 329.137 |
| 7/25/16 | 201.753 | 329.349 |
| 7/26/16 | 201.457 | 328.617 |
| 7/27/16 | 201.668 | 328.516 |
| 7/28/16 | 201.757 | 328.132 |
| 7/29/16 | 202.092 | 327.564 |
| 8/1/16 | 201.836 | 327.49 |
| 8/2/16 | 201.18 | 326.651 |
| 8/3/16 | 201.131 | 327.122 |
| 8/4/16 | 201.822 | 328.693 |
| 8/5/16 | 201.538 | 329.878 |
| 8/8/16 | 201.659 | 330.89 |
| 8/9/16 | 202.023 | 332.085 |
| 8/10/16 | 202.581 | 332.279 |
| 8/11/16 | 202.292 | 332.233 |
| 8/12/16 | 202.742 | 332.807 |
| 8/15/16 | 202.494 | 333.604 |
| 8/16/16 | 202.509 | 334.019 |
| 8/17/16 | 202.553 | 333.806 |
| 8/18/16 | 202.914 | 333.971 |
| 8/19/16 | 202.692 | 334.315 |
| 8/22/16 | 203.125 | 334.283 |
| 8/23/16 | 203.296 | 334.651 |
| 8/24/16 | 203.222 | 334.604 |
| 8/25/16 | 202.969 | 334.231 |
| 8/26/16 | 202.916 | 334.548 |
| 8/29/16 | 203.037 | 334.842 |
| 8/30/16 | 203.139 | 335.049 |
| 8/31/16 | 203.059 | 334.78 |
| 9/1/16 | 202.871 | 334.34 |
| 9/2/16 | 202.722 | 334.945 |
| 9/6/16 | 203.041 | 335.237 |
| 9/7/16 | 203.141 | 335.819 |
| 9/8/16 | 202.44 | 335.868 |
| 9/9/16 | 201.432 | 334.347 |
| 9/12/16 | 201.154 | 333.589 |
| 9/13/16 | 200.682 | 332.561 |
| 9/14/16 | 200.787 | 332.394 |
| 9/15/16 | 200.692 | 332.511 |
| 9/16/16 | 200.887 | 332.517 |
| 9/19/16 | 200.964 | 332.846 |
| 9/20/16 | 201.207 | 332.872 |
| 9/21/16 | 201.226 | 333.856 |
| 9/22/16 | 202.184 | 336.064 |
| 9/23/16 | 202.326 | 335.949 |
| 9/26/16 | 202.455 | 335.719 |
| 9/27/16 | 202.606 | 335.487 |
| 9/28/16 | 202.756 | 336.34 |
| 9/29/16 | 202.701 | 337.009 |
| 9/30/16 | 202.541 | 337.519 |
| 10/3/16 | 202.4 | 337.882 |
| 10/4/16 | 202.001 | 338.121 |
| 10/5/16 | 201.601 | 338.475 |
| 10/6/16 | 201.602 | 338.772 |
| 10/7/16 | 201.662 | 338.989 |
| 10/10/16 | 201.736 | 339.286 |
| 10/11/16 | 201.522 | 339.134 |
| 10/12/16 | 201.442 | 339.132 |
| 10/13/16 | 201.856 | 338.688 |
| 10/14/16 | 201.618 | 339.419 |
| 10/17/16 | 201.809 | 339.829 |
| 10/18/16 | 202.078 | 340.389 |
| 10/19/16 | 202.272 | 341.285 |
| 10/20/16 | 202.311 | 341.63 |
| 10/21/16 | 202.223 | 341.668 |
| 10/24/16 | 202.029 | 342.053 |
| 10/25/16 | 201.952 | 341.971 |
| 10/26/16 | 201.472 | 340.997 |
| 10/27/16 | 200.834 | 340.116 |
| 10/28/16 | 200.697 | 339.489 |
| 10/31/16 | 200.748 | 338.526 |
| 11/1/16 | 200.44 | 336.691 |
| 11/2/16 | 200.618 | 334.99 |
| 11/3/16 | 200.52 | 335.281 |
| 11/4/16 | 200.739 | 335.071 |
| 11/7/16 | 200.781 | 337.16 |
| 11/8/16 | 200.576 | 337.354 |
| 11/9/16 | 199.257 | 336.143 |
| 11/10/16 | 198.676 | 334.522 |
| 11/11/16 | 198.706 | 334.383 |
| 11/14/16 | 197.184 | 330.657 |
| 11/15/16 | 197.322 | 332.754 |
| 11/16/16 | 197.312 | 333.201 |
| 11/17/16 | 196.871 | 333.991 |
| 11/18/16 | 196.159 | 333.597 |
| 11/21/16 | 196.094 | 334.144 |
| 11/22/16 | 196.3 | 335.182 |
| 11/23/16 | 195.73 | 335.333 |
| 11/25/16 | 195.865 | 335.383 |
| 11/28/16 | 196.339 | 335.883 |
| 11/29/16 | 196.462 | 335.624 |
| 11/30/16 | 196.205 | 336.247 |
| 12/1/16 | 195.627 | 336.019 |
| 12/2/16 | 196.182 | 336.18 |
| 12/5/16 | 196.294 | 337.066 |
| 12/6/16 | 196.339 | 337.959 |
| 12/7/16 | 196.841 | 339.867 |
| 12/8/16 | 196.496 | 340.184 |
| 12/9/16 | 196.035 | 340.76 |
| 12/12/16 | 195.858 | 341.127 |
| 12/13/16 | 196.093 | 341.508 |
| 12/14/16 | 196.245 | 341.608 |
| 12/15/16 | 195.299 | 339.941 |
| 12/16/16 | 195.344 | 339.965 |
| 12/19/16 | 195.733 | 340.285 |
| 12/20/16 | 195.642 | 340.54 |
| 12/21/16 | 196.013 | 340.808 |
| 12/22/16 | 196.046 | 341.289 |
| 12/23/16 | 196.227 | 341.732 |
| 12/27/16 | 196.231 | 341.945 |
| 12/28/16 | 196.591 | 342.601 |
| 12/29/16 | 197.164 | 342.93 |
| 12/30/16 | 197.407 | 342.84 |
| 1/3/17 | 197.43 | 343.615 |
| 1/4/17 | 197.758 | 344.832 |
| 1/5/17 | 198.38 | 345.866 |
| 1/6/17 | 198.077 | 346.307 |
| 1/9/17 | 198.327 | 346.697 |
| 1/10/17 | 198.229 | 346.909 |
| 1/11/17 | 198.285 | 346.579 |
| 1/12/17 | 198.625 | 346.694 |
| 1/13/17 | 198.14 | 346.967 |
| 1/17/17 | 198.169 | 347.368 |
| 1/18/17 | 197.652 | 347.15 |
| 1/19/17 | 196.942 | 346.534 |
| 1/20/17 | 196.891 | 346.39 |
| 1/23/17 | 197.622 | 346.514 |
| 1/24/17 | 197.329 | 346.954 |
| 1/25/17 | 196.872 | 347.446 |
| 1/26/17 | 196.877 | 347.852 |
| 1/27/17 | 197.185 | 348.198 |
| 1/30/17 | 197.071 | 348.126 |
| 1/31/17 | 197.244 | 348.14 |
| 2/1/17 | 196.936 | 348.45 |
| 2/2/17 | 197.29 | 348.968 |
| 2/3/17 | 197.513 | 349.807 |
| 2/6/17 | 197.842 | 350.277 |
| 2/7/17 | 198.047 | 350.135 |
| 2/8/17 | 198.355 | 349.51 |
| 2/9/17 | 198.049 | 349.602 |
| 2/10/17 | 197.918 | 350.228 |
| 2/13/17 | 197.874 | 350.803 |
| 2/14/17 | 197.64 | 350.922 |
| 2/15/17 | 197.427 | 350.891 |
| 2/16/17 | 197.929 | 350.971 |
| 2/17/17 | 198.216 | 351.087 |
| 2/21/17 | 198.247 | 351.833 |
| 2/22/17 | 198.308 | 352.379 |
| 2/23/17 | 198.751 | 352.958 |
| 2/24/17 | 199.301 | 352.929 |
| 2/27/17 | 199.267 | 353.359 |
| 2/28/17 | 199.286 | 353.461 |
| 3/1/17 | 198.425 | 354.46 |
| 3/2/17 | 198.224 | 354.143 |
| 3/3/17 | 198.231 | 353.795 |
| 3/6/17 | 198.231 | 353.159 |
| 3/7/17 | 197.839 | 352.055 |
| 3/8/17 | 197.117 | 350.522 |
| 3/9/17 | 196.55 | 348.487 |
| 3/10/17 | 196.694 | 349.078 |
| 3/13/17 | 196.517 | 348.476 |
| 3/14/17 | 196.426 | 347.13 |
| 3/15/17 | 196.905 | 348.321 |
| 3/16/17 | 197.461 | 350.636 |
| 3/17/17 | 197.728 | 350.523 |
| 3/20/17 | 197.976 | 350.244 |
| 3/21/17 | 198.383 | 349.661 |
| 3/22/17 | 198.622 | 348.392 |
| 3/23/17 | 198.587 | 348.921 |
| 3/24/17 | 198.773 | 349.695 |
| 3/27/17 | 199.054 | 349.587 |
| 3/28/17 | 198.938 | 350.707 |
| 3/29/17 | 199.127 | 351.898 |
| 3/30/17 | 198.976 | 353.046 |
| 3/31/17 | 198.967 | 353.575 |
| 4/3/17 | 199.465 | 353.838 |
| 4/4/17 | 199.473 | 353.816 |
| 4/5/17 | 199.484 | 354.476 |
| 4/6/17 | 199.567 | 354.628 |
| 4/7/17 | 199.687 | 354.912 |
| 4/10/17 | 199.62 | 355.105 |
| 4/11/17 | 200.078 | 355.238 |
| 4/12/17 | 200.335 | 354.927 |
| 4/13/17 | 200.61 | 354.929 |
| 4/17/17 | 200.742 | 354.947 |
| 4/18/17 | 201.126 | 354.749 |
| 4/19/17 | 201.039 | 355.092 |
| 4/20/17 | 200.738 | 355.14 |
| 4/21/17 | 200.93 | 355.439 |
| 4/24/17 | 200.6 | 356.018 |
| 4/25/17 | 200.334 | 356.288 |
| 4/26/17 | 200.283 | 356.56 |
| 4/27/17 | 200.577 | 356.729 |
| 4/28/17 | 200.59 | 357.087 |
| 5/1/17 | 200.509 | 357.288 |
| 5/2/17 | 200.667 | 357.643 |
| 5/3/17 | 200.874 | 357.587 |
| 5/4/17 | 200.339 | 356.477 |
| 5/5/17 | 200.425 | 356.226 |
| 5/8/17 | 200.272 | 356.449 |
| 5/9/17 | 200.145 | 356.371 |
| 5/10/17 | 200.396 | 356.613 |
| 5/11/17 | 200.418 | 356.827 |
| 5/12/17 | 201.049 | 357.687 |
| 5/15/17 | 201.225 | 358.284 |
| 5/16/17 | 201.4 | 358.483 |
| 5/17/17 | 202.07 | 358.192 |
| 5/18/17 | 202.097 | 357.132 |
| 5/19/17 | 202.084 | 358.198 |
| 5/22/17 | 202.173 | 358.74 |
| 5/23/17 | 201.965 | 358.83 |
| 5/24/17 | 201.797 | 359.157 |
| 5/25/17 | 201.88 | 359.424 |
| 5/26/17 | 202.142 | 359.498 |
| 5/30/17 | 202.338 | 359.772 |
| 5/31/17 | 202.493 | 359.658 |
| 6/1/17 | 202.403 | 359.892 |
| 6/2/17 | 202.989 | 360.435 |
| 6/5/17 | 202.966 | 360.48 |
| 6/6/17 | 203.324 | 360.493 |
| 6/7/17 | 203.138 | 360.17 |
| 6/8/17 | 202.843 | 359.48 |
| 6/9/17 | 202.71 | 359.563 |
| 6/12/17 | 202.782 | 359.812 |
| 6/13/17 | 202.819 | 360.223 |
| 6/14/17 | 203.663 | 360.576 |
| 6/15/17 | 203.446 | 360.163 |
| 6/16/17 | 203.555 | 359.961 |
| 6/19/17 | 203.462 | 360.106 |
| 6/20/17 | 203.648 | 359.217 |
| 6/21/17 | 203.684 | 358.429 |
| 6/22/17 | 203.8 | 358.065 |
| 6/23/17 | 203.873 | 358.472 |
| 6/26/17 | 204.216 | 359.174 |
| 6/27/17 | 203.689 | 359.208 |
| 6/28/17 | 203.589 | 359.381 |
| 6/29/17 | 203.322 | 359.377 |
| 6/30/17 | 203.285 | 359.583 |
| 7/3/17 | 203.108 | 359.782 |
| 7/5/17 | 202.972 | 359.598 |
| 7/6/17 | 202.698 | 358.856 |
| 7/7/17 | 202.619 | 358.285 |
| 7/10/17 | 202.891 | 358.575 |
| 7/11/17 | 202.912 | 358.677 |
| 7/12/17 | 203.439 | 359.724 |
| 7/13/17 | 203.264 | 359.833 |
| 7/14/17 | 203.603 | 360.614 |
| 7/17/17 | 203.737 | 361.435 |
| 7/18/17 | 204.228 | 361.793 |
| 7/19/17 | 204.34 | 362.37 |
| 7/20/17 | 204.539 | 362.884 |
| 7/21/17 | 204.801 | 362.818 |
| 7/24/17 | 204.668 | 362.997 |
| 7/25/17 | 204.056 | 362.902 |
| 7/26/17 | 204.125 | 363.404 |
| 7/27/17 | 204.134 | 363.405 |
| 7/28/17 | 204.328 | 363.531 |
| 7/31/17 | 204.413 | 363.556 |
| 8/1/17 | 204.707 | 363.713 |
| 8/2/17 | 204.75 | 363.821 |
| 8/3/17 | 204.853 | 363.671 |
| 8/4/17 | 204.488 | 363.324 |
| 8/7/17 | 204.49 | 363.558 |
| 8/8/17 | 204.185 | 363.087 |
| 8/9/17 | 204.147 | 361.804 |
| 8/10/17 | 204.054 | 360.703 |
| 8/11/17 | 204.041 | 360.437 |
| 8/14/17 | 204.266 | 361.371 |
| 8/15/17 | 204.078 | 361.32 |
| 8/16/17 | 204.306 | 361.514 |
| 8/17/17 | 204.556 | 361.293 |
| 8/18/17 | 204.624 | 360.717 |
| 8/21/17 | 204.71 | 361.038 |
| 8/22/17 | 204.563 | 361.391 |
| 8/23/17 | 204.841 | 361.447 |
| 8/24/17 | 204.85 | 361.979 |
| 8/25/17 | 204.999 | 362.377 |
| 8/28/17 | 205.148 | 362.764 |
| 8/29/17 | 205.368 | 362.912 |
| 8/30/17 | 205.298 | 363.254 |
| 8/31/17 | 205.497 | 364.065 |
| 9/1/17 | 205.422 | 364.417 |
| 9/5/17 | 205.84 | 364.655 |
| 9/6/17 | 205.756 | 364.724 |
| 9/7/17 | 205.946 | 364.736 |
| 9/8/17 | 205.79 | 364.407 |
| 9/11/17 | 205.368 | 364.439 |
| 9/12/17 | 205.091 | 364.454 |
| 9/13/17 | 205.087 | 364.749 |
| 9/14/17 | 205.089 | 364.887 |
| 9/15/17 | 205.276 | 364.962 |
| 9/18/17 | 205.242 | 365.376 |
| 9/19/17 | 205.301 | 365.589 |
| 9/20/17 | 205.237 | 365.623 |
| 9/21/17 | 205.125 | 365.342 |
| 9/22/17 | 205.239 | 365.571 |
| 9/25/17 | 205.612 | 365.876 |
| 9/26/17 | 205.635 | 366.23 |
| 9/27/17 | 205.16 | 366 |
| 9/28/17 | 205.243 | 366.276 |
| 9/29/17 | 205.521 | 366.805 |
| 10/2/17 | 205.631 | 367.012 |
| 10/3/17 | 205.83 | 367.419 |
| 10/4/17 | 205.767 | 367.45 |
| 10/5/17 | 205.659 | 367.693 |
| 10/6/17 | 205.474 | 367.479 |
| 10/9/17 | 205.566 | 367.715 |
| 10/10/17 | 205.769 | 367.888 |
| 10/11/17 | 205.702 | 367.873 |
| 10/12/17 | 205.671 | 367.653 |
| 10/13/17 | 206.123 | 367.686 |
| 10/16/17 | 206.097 | 368.033 |
| 10/17/17 | 206.026 | 368.276 |
| 10/18/17 | 205.774 | 368.357 |
| 10/19/17 | 205.998 | 368.629 |
| 10/20/17 | 205.649 | 368.624 |
| 10/23/17 | 205.843 | 368.998 |
| 10/24/17 | 205.565 | 368.765 |
| 10/25/17 | 205.144 | 368.013 |
| 10/26/17 | 205.148 | 367.99 |
| 10/27/17 | 205.331 | 367.842 |
| 10/30/17 | 205.802 | 367.967 |
| 10/31/17 | 205.723 | 368.114 |
| 11/1/17 | 205.824 | 368.183 |
| 11/2/17 | 205.795 | 367.927 |
| 11/3/17 | 205.836 | 368 |
| 11/6/17 | 205.9 | 367.743 |
| 11/7/17 | 205.749 | 367.284 |
| 11/8/17 | 205.649 | 366.063 |
| 11/9/17 | 205.288 | 364.573 |
| 11/10/17 | 204.603 | 364.356 |
| 11/13/17 | 204.652 | 364.318 |
| 11/14/17 | 204.691 | 363.502 |
| 11/15/17 | 204.882 | 362.511 |
| 11/16/17 | 204.979 | 364.571 |
| 11/17/17 | 205.199 | 364.981 |
| 11/20/17 | 205.18 | 365.304 |
| 11/21/17 | 205.516 | 365.757 |
| 11/22/17 | 205.835 | 366.155 |
| 11/24/17 | 205.943 | 366.543 |
| 11/27/17 | 205.966 | 366.761 |
| 11/28/17 | 206.095 | 366.796 |
| 11/29/17 | 205.654 | 366.824 |
| 11/30/17 | 205.486 | 366.767 |
| 12/1/17 | 205.92 | 367.053 |
| 12/4/17 | 205.936 | 367.213 |
| 12/5/17 | 206.193 | 367.502 |
| 12/6/17 | 206.601 | 367.317 |
| 12/7/17 | 206.335 | 366.974 |
| 12/8/17 | 206.076 | 366.87 |
| 12/11/17 | 206.204 | 367.016 |
| 12/12/17 | 206.011 | 367.197 |
| 12/13/17 | 206.421 | 367.425 |
| 12/14/17 | 206.69 | 367.409 |
| 12/15/17 | 206.786 | 367.316 |
| 12/18/17 | 206.647 | 367.124 |
| 12/19/17 | 206.018 | 366.974 |
| 12/20/17 | 205.63 | 366.619 |
| 12/21/17 | 205.761 | 366.887 |
| 12/22/17 | 205.837 | 366.991 |
| 12/26/17 | 205.984 | 367.186 |
| 12/27/17 | 206.535 | 367.226 |
| 12/28/17 | 206.756 | 367.69 |
| 12/29/17 | 206.865 | 367.892 |
| 1/1/18 | 206.865 | 367.892 |
| 1/2/18 | 206.236 | 367.981 |
| 1/3/18 | 206.358 | 368.997 |
| 1/4/18 | 206.214 | 369.868 |
| 1/5/18 | 206.21 | 370.223 |
| 1/8/18 | 206.268 | 370.533 |
| 1/9/18 | 205.924 | 370.325 |
| 1/10/18 | 205.698 | 369.516 |
| 1/11/18 | 206.019 | 370.071 |
| 1/12/18 | 206.029 | 370.201 |
| 1/15/18 | 206.029 | 370.201 |
| 1/16/18 | 206.243 | 370.532 |
| 1/17/18 | 205.936 | 370.334 |
| 1/18/18 | 205.462 | 369.876 |
| 1/19/18 | 205.093 | 369.578 |
| 1/22/18 | 204.95 | 369.869 |
| 1/23/18 | 205.272 | 370.191 |
| 1/24/18 | 205.1 | 370.631 |
| 1/25/18 | 205.504 | 371.115 |
| 1/26/18 | 205.532 | 371.196 |
| 1/29/18 | 205.294 | 370.548 |
| 1/30/18 | 204.979 | 369.661 |
| 1/31/18 | 205.098 | 370.087 |
| 2/1/18 | 204.944 | 369.568 |
| 2/2/18 | 204.178 | 368.112 |
| 2/5/18 | 204.038 | 367.136 |
| 2/6/18 | 204.095 | 365.863 |
| 2/7/18 | 203.934 | 366.902 |
| 2/8/18 | 203.185 | 364.997 |
| 2/9/18 | 202.662 | 362.325 |
| 2/12/18 | 202.596 | 363.207 |
| 2/13/18 | 202.217 | 362.548 |
| 2/14/18 | 201.952 | 362.185 |
| 2/15/18 | 202.341 | 364.346 |
| 2/16/18 | 202.676 | 365.858 |
| 2/19/18 | 202.676 | 365.858 |
| 2/20/18 | 202.241 | 365.533 |
| 2/21/18 | 202.077 | 365.42 |
| 2/22/18 | 201.968 | 364.794 |
| 2/23/18 | 202.224 | 364.946 |
| 2/26/18 | 202.627 | 366.203 |
| 2/27/18 | 202.125 | 366.044 |
| 2/28/18 | 202.11 | 365.977 |
| 3/1/18 | 202.091 | 365.376 |
| 3/2/18 | 201.793 | 364.078 |
| 3/5/18 | 201.862 | 364.847 |
| 3/6/18 | 202.078 | 365.692 |
| 3/7/18 | 201.963 | 365.478 |
| 3/8/18 | 202.026 | 365.471 |
| 3/9/18 | 201.651 | 365.539 |
| 3/12/18 | 201.632 | 365.337 |
| 3/13/18 | 201.745 | 365.388 |
| 3/14/18 | 201.97 | 365.058 |
| 3/15/18 | 201.911 | 364.876 |
| 3/16/18 | 201.965 | 364.95 |
| 3/19/18 | 201.815 | 364.55 |
| 3/20/18 | 201.386 | 364.279 |
| 3/21/18 | 201.054 | 364.195 |
| 3/22/18 | 201.426 | 363.894 |
| 3/23/18 | 201.269 | 363.557 |
| 3/26/18 | 201.407 | 363.656 |
| 3/27/18 | 201.895 | 364.228 |
| 3/28/18 | 202.221 | 364.089 |
| 3/29/18 | 202.639 | 364.548 |
| 3/30/18 | 202.639 | 364.548 |
| 4/2/18 | 202.723 | 364.217 |
| 4/3/18 | 202.506 | 364.286 |
| 4/4/18 | 202.534 | 364.286 |
| 4/5/18 | 202.436 | 365.501 |
| 4/6/18 | 202.796 | 365.788 |
| 4/9/18 | 202.961 | 366.085 |
| 4/10/18 | 203.035 | 367.052 |
| 4/11/18 | 203.195 | 367.445 |
| 4/12/18 | 202.944 | 368.039 |
| 4/13/18 | 202.901 | 368.445 |
| 4/16/18 | 202.827 | 368.982 |
| 4/17/18 | 202.981 | 369.527 |
| 4/18/18 | 202.569 | 369.434 |
| 4/19/18 | 201.785 | 368.211 |
| 4/20/18 | 201.48 | 367.589 |
| 4/23/18 | 201.193 | 366.964 |
| 4/24/18 | 201.02 | 366.512 |
| 4/25/18 | 200.527 | 365.31 |
| 4/26/18 | 200.81 | 366.127 |
| 4/27/18 | 201.055 | 366.265 |
| 4/30/18 | 201.158 | 366.328 |
| 5/1/18 | 200.773 | 365.704 |
| 5/2/18 | 200.693 | 365.948 |
| 5/3/18 | 200.871 | 365.697 |
| 5/4/18 | 200.72 | 365.613 |
| 5/7/18 | 200.796 | 366.32 |
| 5/8/18 | 200.584 | 365.795 |
| 5/9/18 | 200.607 | 365.84 |
| 5/10/18 | 201.039 | 366.743 |
| 5/11/18 | 201.344 | 367.197 |
| 5/14/18 | 201.332 | 367.421 |
| 5/15/18 | 200.385 | 366.487 |
| 5/16/18 | 200.263 | 366.342 |
| 5/17/18 | 200.023 | 366.084 |
| 5/18/18 | 200.234 | 365.813 |
| 5/21/18 | 200.388 | 366.206 |
| 5/22/18 | 200.409 | 366.367 |
| 5/23/18 | 200.848 | 366.335 |
| 5/24/18 | 201.258 | 366.279 |
| 5/25/18 | 201.609 | 366.393 |
| 5/28/18 | 201.609 | 366.393 |
| 5/29/18 | 202.227 | 365.778 |
| 5/30/18 | 201.982 | 365.888 |
| 5/31/18 | 202.056 | 366.404 |
| 6/1/18 | 201.661 | 366.018 |
| 6/4/18 | 201.476 | 366.472 |
| 6/5/18 | 201.464 | 366.75 |
| 6/6/18 | 200.899 | 366.654 |
| 6/7/18 | 201.088 | 366.763 |
| 6/8/18 | 201.179 | 366.746 |
| 6/11/18 | 200.941 | 367.06 |
| 6/12/18 | 200.944 | 367.199 |
| 6/13/18 | 201.001 | 367.776 |
| 6/14/18 | 201.296 | 368.126 |
| 6/15/18 | 201.48 | 368.156 |
| 6/18/18 | 201.203 | 368.064 |
| 6/19/18 | 201.264 | 367.584 |
| 6/20/18 | 200.902 | 368.12 |
| 6/21/18 | 200.538 | 367.768 |
| 6/22/18 | 200.647 | 368.003 |
| 6/25/18 | 200.747 | 367.625 |
| 6/26/18 | 200.862 | 367.43 |
| 6/27/18 | 201.381 | 367.56 |
| 6/28/18 | 201.268 | 366.286 |
| 6/29/18 | 201.482 | 366.683 |
| 7/2/18 | 201.363 | 365.801 |
| 7/3/18 | 201.674 | 366.425 |
| 7/4/18 | 201.674 | 366.425 |
| 7/5/18 | 202.071 | 366.925 |
| 7/6/18 | 202.349 | 367.366 |
| 7/9/18 | 202.425 | 368.212 |
| 7/10/18 | 202.482 | 368.743 |
| 7/11/18 | 202.564 | 368.552 |
| 7/12/18 | 202.769 | 368.96 |
| 7/13/18 | 203.05 | 369.352 |
| 7/16/18 | 202.904 | 369.443 |
| 7/17/18 | 202.825 | 369.324 |
| 7/18/18 | 202.783 | 369.485 |
| 7/19/18 | 202.956 | 369.501 |
| 7/20/18 | 202.716 | 369.629 |
| 7/23/18 | 202.256 | 369.628 |
| 7/24/18 | 202.488 | 369.978 |
| 7/25/18 | 202.705 | 370.297 |
| 7/26/18 | 202.761 | 370.919 |
| 7/27/18 | 202.965 | 371.144 |
| 7/30/18 | 202.856 | 371.147 |
| 7/31/18 | 203.097 | 371.747 |
| 8/1/18 | 202.713 | 371.487 |
| 8/2/18 | 202.773 | 371.679 |
| 8/3/18 | 203.214 | 372.305 |
| 8/6/18 | 203.574 | 372.715 |
| 8/7/18 | 203.267 | 372.958 |
| 8/8/18 | 202.999 | 372.802 |
| 8/9/18 | 203.111 | 372.559 |
| 8/10/18 | 203.256 | 371.985 |
| 8/13/18 | 203.248 | 371.683 |
| 8/14/18 | 203.391 | 371.999 |
| 8/15/18 | 203.641 | 371.772 |
| 8/16/18 | 203.733 | 372.168 |
| 8/17/18 | 203.926 | 372.41 |
| 8/20/18 | 204.314 | 372.942 |
| 8/21/18 | 204.132 | 373.187 |
| 8/22/18 | 204.145 | 373.293 |
| 8/23/18 | 204.165 | 373.205 |
| 8/24/18 | 204.143 | 373.291 |
| 8/27/18 | 204.122 | 373.565 |
| 8/28/18 | 203.864 | 373.642 |
| 8/29/18 | 203.7 | 373.495 |
| 8/30/18 | 203.77 | 373.324 |
| 8/31/18 | 203.831 | 373.233 |
| 9/3/18 | 203.831 | 373.233 |
| 9/4/18 | 203.242 | 372.692 |
| 9/5/18 | 203.269 | 372.444 |
| 9/6/18 | 203.637 | 372.733 |
| 9/7/18 | 203.185 | 372.674 |
| 9/10/18 | 203.37 | 372.852 |
| 9/11/18 | 203.134 | 372.963 |
| 9/12/18 | 203.407 | 373.297 |
| 9/13/18 | 203.605 | 373.833 |
| 9/14/18 | 203.463 | 373.927 |
| 9/17/18 | 203.466 | 374.179 |
| 9/18/18 | 203.037 | 374.23 |
| 9/19/18 | 202.756 | 373.853 |
| 9/20/18 | 203.078 | 373.976 |
| 9/21/18 | 203.131 | 374.155 |
| 9/24/18 | 202.983 | 374.196 |
| 9/25/18 | 202.825 | 373.935 |
| 9/26/18 | 203.115 | 374.308 |
| 9/27/18 | 203.378 | 374.725 |
| 9/28/18 | 203.529 | 374.94 |
| 10/1/18 | 203.411 | 375.475 |
| 10/2/18 | 203.54 | 375.702 |
| 10/3/18 | 202.822 | 375.539 |
| 10/4/18 | 202.191 | 373.8 |
| 10/5/18 | 201.812 | 373.135 |
| 10/8/18 | 201.939 | 373.424 |
| 10/9/18 | 201.82 | 372.312 |
| 10/10/18 | 201.559 | 371.131 |
| 10/11/18 | 201.989 | 371.075 |
| 10/12/18 | 202.069 | 371.98 |
| 10/15/18 | 201.945 | 372.054 |
| 10/16/18 | 201.996 | 372.804 |
| 10/17/18 | 201.894 | 372.649 |
| 10/18/18 | 201.613 | 371.926 |
| 10/19/18 | 201.423 | 371.656 |
| 10/22/18 | 201.392 | 371.541 |
| 10/23/18 | 201.399 | 370.348 |
| 10/24/18 | 201.624 | 370.545 |
| 10/25/18 | 201.4 | 369.922 |
| 10/26/18 | 201.67 | 369.266 |
| 10/29/18 | 201.55 | 369.33 |
| 10/30/18 | 201.188 | 368.514 |
| 10/31/18 | 200.926 | 369.575 |